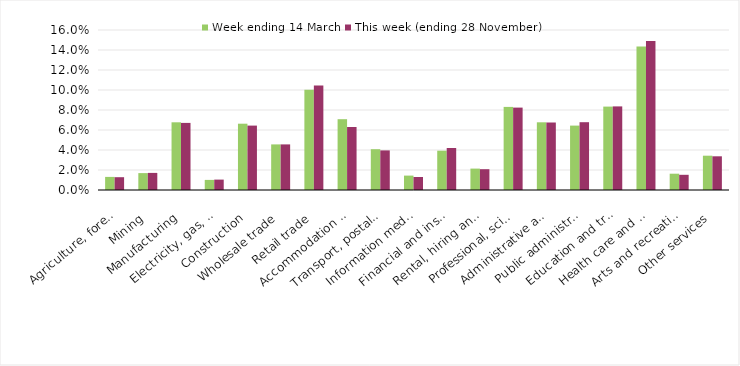
| Category | Week ending 14 March | This week (ending 28 November) |
|---|---|---|
| Agriculture, forestry and fishing | 0.013 | 0.013 |
| Mining | 0.017 | 0.017 |
| Manufacturing | 0.068 | 0.067 |
| Electricity, gas, water and waste services | 0.01 | 0.01 |
| Construction | 0.066 | 0.064 |
| Wholesale trade | 0.046 | 0.046 |
| Retail trade | 0.1 | 0.105 |
| Accommodation and food services | 0.071 | 0.063 |
| Transport, postal and warehousing | 0.041 | 0.04 |
| Information media and telecommunications | 0.014 | 0.013 |
| Financial and insurance services | 0.039 | 0.042 |
| Rental, hiring and real estate services | 0.021 | 0.021 |
| Professional, scientific and technical services | 0.083 | 0.082 |
| Administrative and support services | 0.068 | 0.068 |
| Public administration and safety | 0.064 | 0.068 |
| Education and training | 0.083 | 0.084 |
| Health care and social assistance | 0.144 | 0.149 |
| Arts and recreation services | 0.016 | 0.015 |
| Other services | 0.034 | 0.034 |